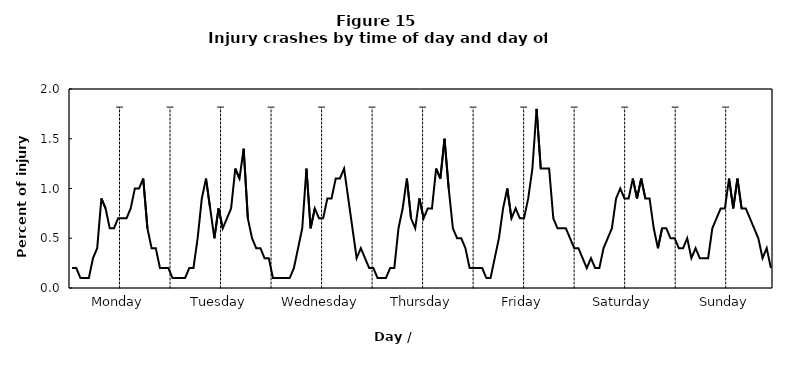
| Category | Injury crashes |
|---|---|
| 0 | 0.2 |
| 1 | 0.2 |
| 2 | 0.1 |
| 3 | 0.1 |
| 4 | 0.1 |
| 5 | 0.3 |
| 6 | 0.4 |
| 7 | 0.9 |
| 8 | 0.8 |
| 9 | 0.6 |
| 10 | 0.6 |
| 11 | 0.7 |
| 12 | 0.7 |
| 13 | 0.7 |
| 14 | 0.8 |
| 15 | 1 |
| 16 | 1 |
| 17 | 1.1 |
| 18 | 0.6 |
| 19 | 0.4 |
| 20 | 0.4 |
| 21 | 0.2 |
| 22 | 0.2 |
| 23 | 0.2 |
| 24 | 0.1 |
| 25 | 0.1 |
| 26 | 0.1 |
| 27 | 0.1 |
| 28 | 0.2 |
| 29 | 0.2 |
| 30 | 0.5 |
| 31 | 0.9 |
| 32 | 1.1 |
| 33 | 0.8 |
| 34 | 0.5 |
| 35 | 0.8 |
| 36 | 0.6 |
| 37 | 0.7 |
| 38 | 0.8 |
| 39 | 1.2 |
| 40 | 1.1 |
| 41 | 1.4 |
| 42 | 0.7 |
| 43 | 0.5 |
| 44 | 0.4 |
| 45 | 0.4 |
| 46 | 0.3 |
| 47 | 0.3 |
| 48 | 0.1 |
| 49 | 0.1 |
| 50 | 0.1 |
| 51 | 0.1 |
| 52 | 0.1 |
| 53 | 0.2 |
| 54 | 0.4 |
| 55 | 0.6 |
| 56 | 1.2 |
| 57 | 0.6 |
| 58 | 0.8 |
| 59 | 0.7 |
| 60 | 0.7 |
| 61 | 0.9 |
| 62 | 0.9 |
| 63 | 1.1 |
| 64 | 1.1 |
| 65 | 1.2 |
| 66 | 0.9 |
| 67 | 0.6 |
| 68 | 0.3 |
| 69 | 0.4 |
| 70 | 0.3 |
| 71 | 0.2 |
| 72 | 0.2 |
| 73 | 0.1 |
| 74 | 0.1 |
| 75 | 0.1 |
| 76 | 0.2 |
| 77 | 0.2 |
| 78 | 0.6 |
| 79 | 0.8 |
| 80 | 1.1 |
| 81 | 0.7 |
| 82 | 0.6 |
| 83 | 0.9 |
| 84 | 0.7 |
| 85 | 0.8 |
| 86 | 0.8 |
| 87 | 1.2 |
| 88 | 1.1 |
| 89 | 1.5 |
| 90 | 1 |
| 91 | 0.6 |
| 92 | 0.5 |
| 93 | 0.5 |
| 94 | 0.4 |
| 95 | 0.2 |
| 96 | 0.2 |
| 97 | 0.2 |
| 98 | 0.2 |
| 99 | 0.1 |
| 100 | 0.1 |
| 101 | 0.3 |
| 102 | 0.5 |
| 103 | 0.8 |
| 104 | 1 |
| 105 | 0.7 |
| 106 | 0.8 |
| 107 | 0.7 |
| 108 | 0.7 |
| 109 | 0.9 |
| 110 | 1.2 |
| 111 | 1.8 |
| 112 | 1.2 |
| 113 | 1.2 |
| 114 | 1.2 |
| 115 | 0.7 |
| 116 | 0.6 |
| 117 | 0.6 |
| 118 | 0.6 |
| 119 | 0.5 |
| 120 | 0.4 |
| 121 | 0.4 |
| 122 | 0.3 |
| 123 | 0.2 |
| 124 | 0.3 |
| 125 | 0.2 |
| 126 | 0.2 |
| 127 | 0.4 |
| 128 | 0.5 |
| 129 | 0.6 |
| 130 | 0.9 |
| 131 | 1 |
| 132 | 0.9 |
| 133 | 0.9 |
| 134 | 1.1 |
| 135 | 0.9 |
| 136 | 1.1 |
| 137 | 0.9 |
| 138 | 0.9 |
| 139 | 0.6 |
| 140 | 0.4 |
| 141 | 0.6 |
| 142 | 0.6 |
| 143 | 0.5 |
| 144 | 0.5 |
| 145 | 0.4 |
| 146 | 0.4 |
| 147 | 0.5 |
| 148 | 0.3 |
| 149 | 0.4 |
| 150 | 0.3 |
| 151 | 0.3 |
| 152 | 0.3 |
| 153 | 0.6 |
| 154 | 0.7 |
| 155 | 0.8 |
| 156 | 0.8 |
| 157 | 1.1 |
| 158 | 0.8 |
| 159 | 1.1 |
| 160 | 0.8 |
| 161 | 0.8 |
| 162 | 0.7 |
| 163 | 0.6 |
| 164 | 0.5 |
| 165 | 0.3 |
| 166 | 0.4 |
| 167 | 0.2 |